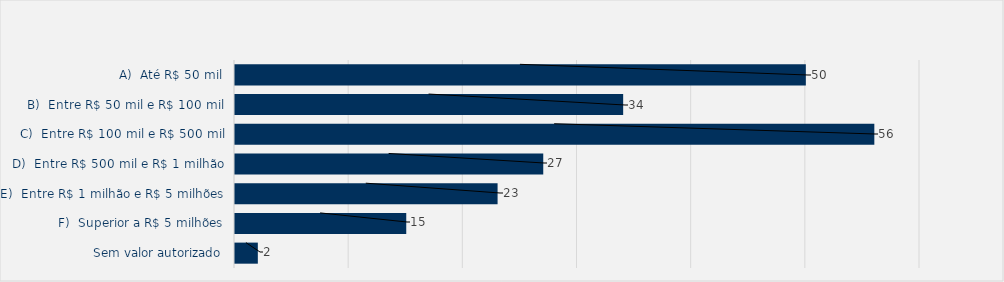
| Category | Total |
|---|---|
| A)  Até R$ 50 mil | 50 |
| B)  Entre R$ 50 mil e R$ 100 mil | 34 |
| C)  Entre R$ 100 mil e R$ 500 mil | 56 |
| D)  Entre R$ 500 mil e R$ 1 milhão | 27 |
| E)  Entre R$ 1 milhão e R$ 5 milhões | 23 |
| F)  Superior a R$ 5 milhões | 15 |
| Sem valor autorizado | 2 |